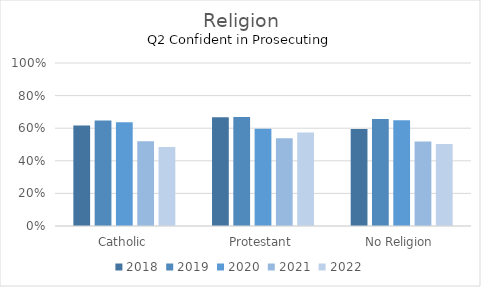
| Category | 2018 | 2019 | 2020 | 2021 | 2022 |
|---|---|---|---|---|---|
| Catholic | 0.616 | 0.647 | 0.636 | 0.52 | 0.485 |
| Protestant | 0.667 | 0.668 | 0.596 | 0.538 | 0.574 |
| No Religion | 0.595 | 0.656 | 0.649 | 0.518 | 0.503 |